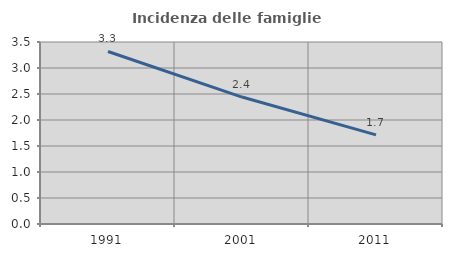
| Category | Incidenza delle famiglie numerose |
|---|---|
| 1991.0 | 3.318 |
| 2001.0 | 2.441 |
| 2011.0 | 1.714 |